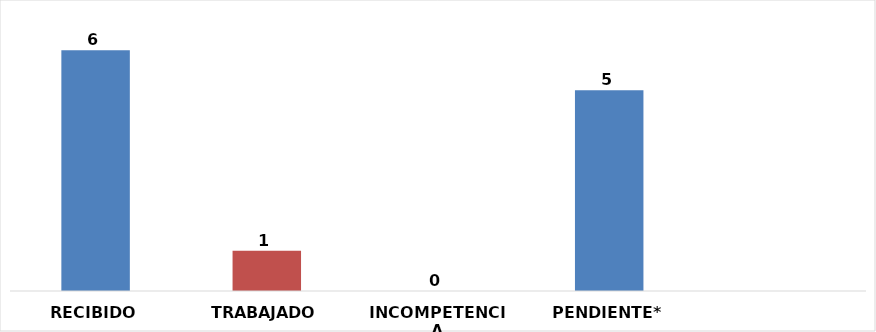
| Category | RECIBIDO |
|---|---|
| RECIBIDO | 6 |
| TRABAJADO | 1 |
| INCOMPETENCIA | 0 |
| PENDIENTE* | 5 |